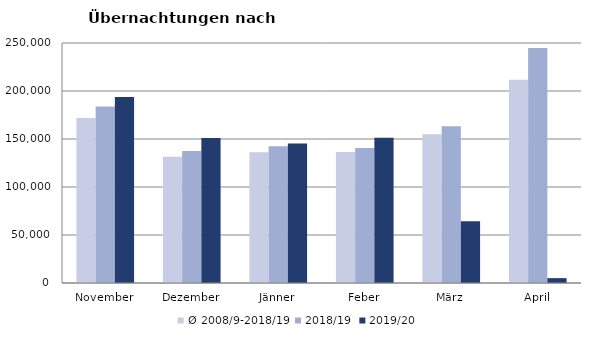
| Category | Ø 2008/9-2018/19 | 2018/19 | 2019/20 |
|---|---|---|---|
| November | 171903.182 | 183958 | 193867 |
| Dezember | 131534.727 | 137414 | 151031 |
| Jänner | 136068.727 | 142561 | 145353 |
| Feber | 136576.364 | 140588 | 151431 |
| März | 154899.636 | 163253 | 64358 |
| April | 211739.545 | 244826 | 5072 |